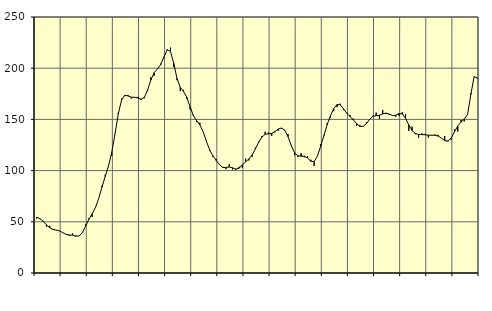
| Category | Piggar | Series 1 |
|---|---|---|
| nan | 53.3 | 54.45 |
| 87.0 | 53.4 | 53.05 |
| 87.0 | 51 | 50.53 |
| 87.0 | 45.3 | 47.12 |
| nan | 46.1 | 44.13 |
| 88.0 | 42.1 | 42.6 |
| 88.0 | 41.7 | 41.92 |
| 88.0 | 41.2 | 41.13 |
| nan | 39.3 | 39.44 |
| 89.0 | 37.7 | 37.67 |
| 89.0 | 36.1 | 37.12 |
| 89.0 | 38.6 | 36.99 |
| nan | 35.5 | 36.23 |
| 90.0 | 36.2 | 36.11 |
| 90.0 | 39 | 39.35 |
| 90.0 | 47.3 | 45.77 |
| nan | 53.4 | 52.36 |
| 91.0 | 54.7 | 57.78 |
| 91.0 | 64 | 63.8 |
| 91.0 | 72.6 | 72.7 |
| nan | 85.1 | 83.72 |
| 92.0 | 95.9 | 94.19 |
| 92.0 | 103.7 | 104.45 |
| 92.0 | 114.3 | 117.66 |
| nan | 135.5 | 135.84 |
| 93.0 | 156.6 | 155.16 |
| 93.0 | 170.3 | 168.78 |
| 93.0 | 172.8 | 173.6 |
| nan | 173.9 | 172.88 |
| 94.0 | 170.4 | 171.72 |
| 94.0 | 171.8 | 171.63 |
| 94.0 | 172 | 170.96 |
| nan | 168.9 | 169.65 |
| 95.0 | 170.6 | 171.5 |
| 95.0 | 177.6 | 178.84 |
| 95.0 | 191.1 | 188.59 |
| nan | 192.5 | 195.68 |
| 96.0 | 199.5 | 199.27 |
| 96.0 | 204.4 | 203.44 |
| 96.0 | 210.2 | 211.03 |
| nan | 218.7 | 217.95 |
| 97.0 | 220.1 | 216.45 |
| 97.0 | 201.3 | 204.65 |
| 97.0 | 188.3 | 190.02 |
| nan | 177.6 | 181.33 |
| 98.0 | 178.8 | 177.35 |
| 98.0 | 170 | 171.59 |
| 98.0 | 159.6 | 162.53 |
| nan | 154.5 | 153.69 |
| 99.0 | 147.5 | 148.84 |
| 99.0 | 146.8 | 144.59 |
| 99.0 | 137.7 | 137.88 |
| nan | 128.1 | 128.64 |
| 0.0 | 119.6 | 120.19 |
| 0.0 | 113.4 | 114.37 |
| 0.0 | 111.4 | 109.91 |
| nan | 106.1 | 105.8 |
| 1.0 | 102.5 | 103.19 |
| 1.0 | 101.4 | 103.05 |
| 1.0 | 106.2 | 103.52 |
| nan | 101.1 | 102.75 |
| 2.0 | 100.6 | 101.44 |
| 2.0 | 103.8 | 102.33 |
| 2.0 | 103 | 105.45 |
| nan | 111.7 | 108.55 |
| 3.0 | 109.9 | 111.31 |
| 3.0 | 113.5 | 115.17 |
| 3.0 | 122.4 | 121.11 |
| nan | 128.3 | 127.52 |
| 4.0 | 133.7 | 132.64 |
| 4.0 | 137.9 | 135.49 |
| 4.0 | 137.5 | 135.91 |
| nan | 133.9 | 136.22 |
| 5.0 | 137.4 | 138.07 |
| 5.0 | 138.9 | 140.62 |
| 5.0 | 140.6 | 141.57 |
| nan | 139.8 | 139.36 |
| 6.0 | 135.7 | 133.23 |
| 6.0 | 124 | 124.45 |
| 6.0 | 114.9 | 117.42 |
| nan | 113.3 | 114.46 |
| 7.0 | 117 | 114.09 |
| 7.0 | 113 | 114.11 |
| 7.0 | 114 | 112.25 |
| nan | 110.6 | 109.16 |
| 8.0 | 104.7 | 108.81 |
| 8.0 | 114 | 114.03 |
| 8.0 | 125.9 | 123.69 |
| nan | 134.9 | 134.22 |
| 9.0 | 146.4 | 144.85 |
| 9.0 | 151.5 | 153.73 |
| 9.0 | 158 | 160.5 |
| nan | 161.9 | 164.48 |
| 10.0 | 165.3 | 164.25 |
| 10.0 | 159.1 | 160.36 |
| 10.0 | 156.5 | 156 |
| nan | 154.2 | 152.8 |
| 11.0 | 150.7 | 149.54 |
| 11.0 | 143.6 | 145.83 |
| 11.0 | 144.6 | 143.22 |
| nan | 143.2 | 143.13 |
| 12.0 | 147 | 145.78 |
| 12.0 | 150.4 | 150.01 |
| 12.0 | 153.5 | 153.08 |
| nan | 156.6 | 153.64 |
| 13.0 | 150.6 | 153.98 |
| 13.0 | 159.3 | 155.34 |
| 13.0 | 155.2 | 156.17 |
| nan | 154.4 | 155.25 |
| 14.0 | 153.5 | 153.76 |
| 14.0 | 152.5 | 154.06 |
| 14.0 | 153.3 | 155.74 |
| nan | 157 | 155.34 |
| 15.0 | 155.2 | 151.06 |
| 15.0 | 138.8 | 144.6 |
| 15.0 | 142.9 | 139.2 |
| nan | 135.5 | 136.23 |
| 16.0 | 132.1 | 135.23 |
| 16.0 | 136.4 | 135.14 |
| 16.0 | 135.8 | 135 |
| nan | 132.2 | 134.56 |
| 17.0 | 134.8 | 134.55 |
| 17.0 | 135.2 | 134.56 |
| 17.0 | 134.9 | 133.67 |
| nan | 131.4 | 131.62 |
| 18.0 | 133.7 | 129.26 |
| 18.0 | 129.3 | 128.75 |
| 18.0 | 130.1 | 131.92 |
| nan | 140.6 | 137.86 |
| 19.0 | 138.1 | 143.66 |
| 19.0 | 149.4 | 147.36 |
| 19.0 | 148 | 150.32 |
| nan | 154.6 | 154.76 |
| 20.0 | 175.5 | 174.28 |
| 20.0 | 191.9 | 191.74 |
| 20.0 | 190 | 190.44 |